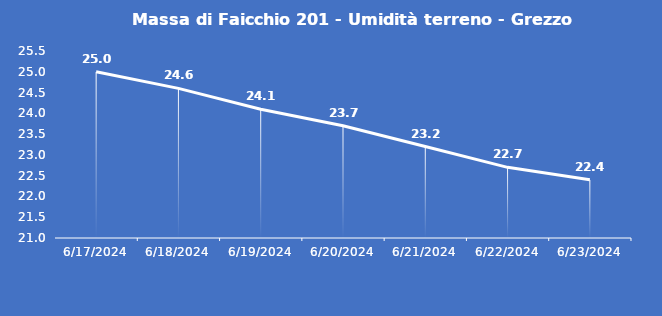
| Category | Massa di Faicchio 201 - Umidità terreno - Grezzo (%VWC) |
|---|---|
| 6/17/24 | 25 |
| 6/18/24 | 24.6 |
| 6/19/24 | 24.1 |
| 6/20/24 | 23.7 |
| 6/21/24 | 23.2 |
| 6/22/24 | 22.7 |
| 6/23/24 | 22.4 |